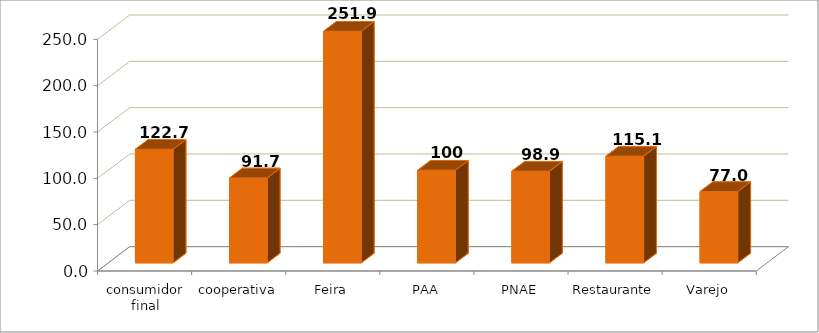
| Category | Series 0 |
|---|---|
| consumidor final | 122.655 |
| cooperativa | 91.667 |
| Feira | 251.927 |
| PAA | 100 |
| PNAE | 98.938 |
| Restaurante | 115.146 |
| Varejo | 76.992 |